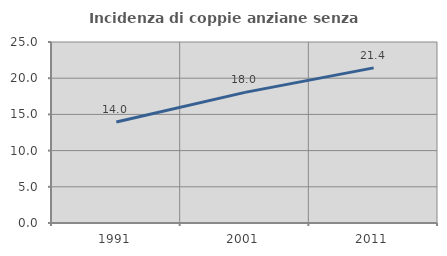
| Category | Incidenza di coppie anziane senza figli  |
|---|---|
| 1991.0 | 13.953 |
| 2001.0 | 18.045 |
| 2011.0 | 21.429 |